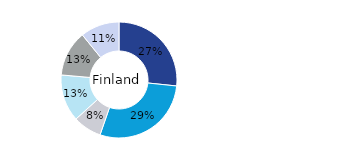
| Category | Finland |
|---|---|
| Office | 0.267 |
| Residential | 0.286 |
| Retail | 0.08 |
| Logistics* | 0.131 |
| Public Sector | 0.127 |
| Other | 0.109 |